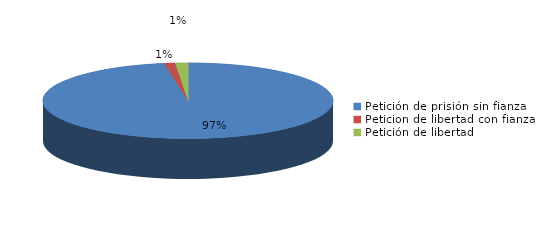
| Category | Series 0 |
|---|---|
| Petición de prisión sin fianza | 480 |
| Peticion de libertad con fianza | 6 |
| Petición de libertad | 7 |